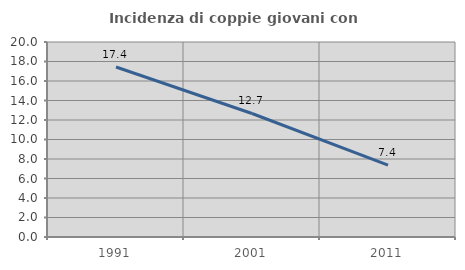
| Category | Incidenza di coppie giovani con figli |
|---|---|
| 1991.0 | 17.439 |
| 2001.0 | 12.668 |
| 2011.0 | 7.365 |